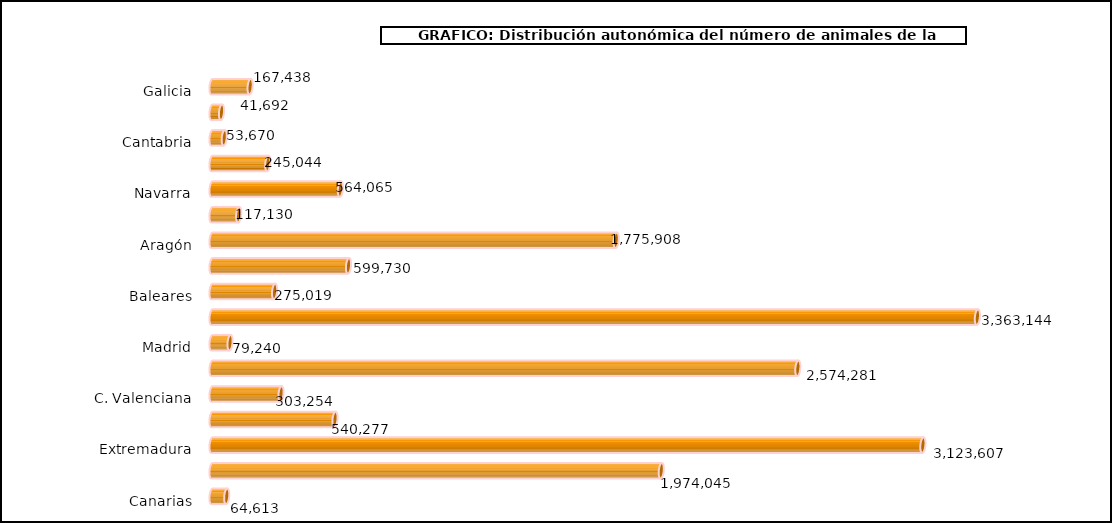
| Category | num. Animales |
|---|---|
|   Galicia | 167438 |
|   P. de Asturias | 41692 |
|   Cantabria | 53670 |
|   País Vasco | 245044 |
|   Navarra | 564065 |
|   La Rioja | 117130 |
|   Aragón | 1775908 |
|   Cataluña | 599730 |
|   Baleares | 275019 |
|   Castilla y León | 3363144 |
|   Madrid | 79240 |
|   Castilla – La Mancha | 2574281 |
|   C. Valenciana | 303254 |
|   R. de Murcia | 540277 |
|   Extremadura | 3123607 |
|   Andalucía | 1974045 |
|   Canarias | 64613 |